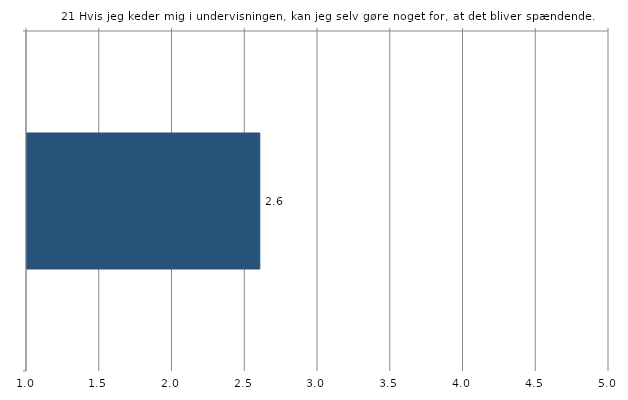
| Category | Gns. |
|---|---|
|   | 2.6 |